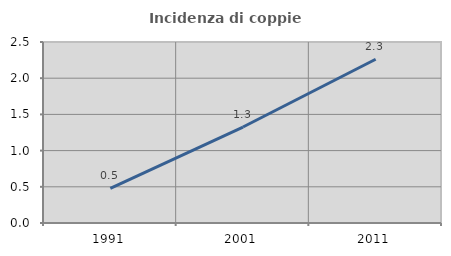
| Category | Incidenza di coppie miste |
|---|---|
| 1991.0 | 0.478 |
| 2001.0 | 1.325 |
| 2011.0 | 2.262 |